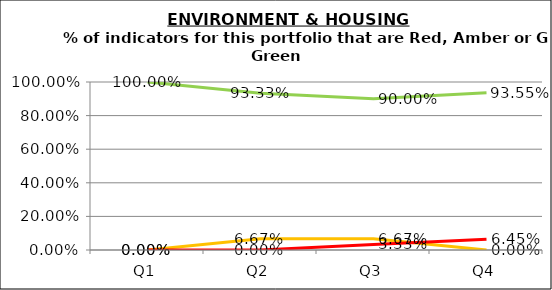
| Category | Green | Amber | Red |
|---|---|---|---|
| Q1 | 1 | 0 | 0 |
| Q2 | 0.933 | 0.067 | 0 |
| Q3 | 0.9 | 0.067 | 0.033 |
| Q4 | 0.935 | 0 | 0.065 |